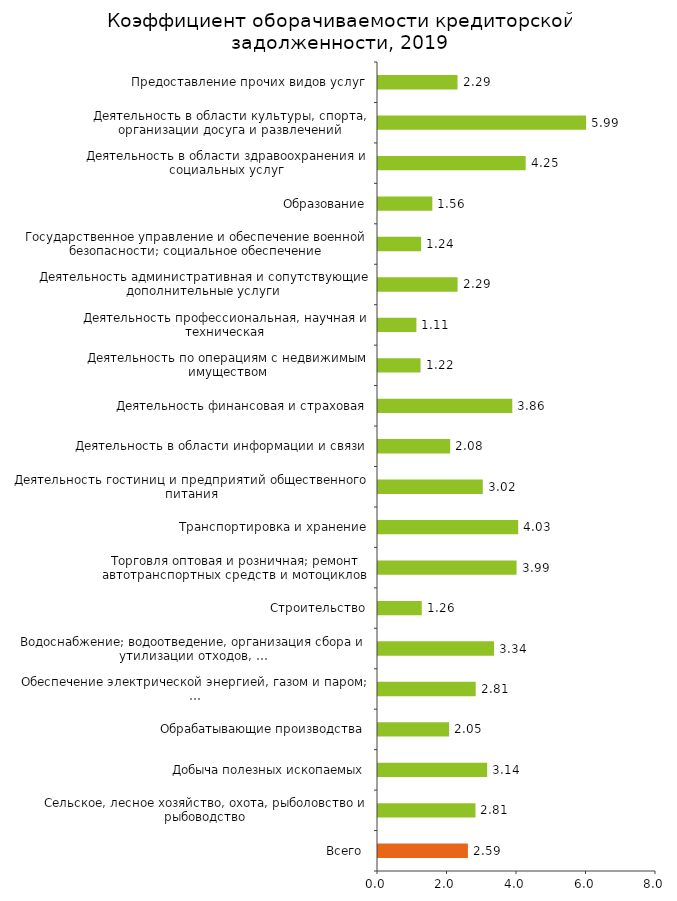
| Category | Series 0 |
|---|---|
| Всего  | 2.587 |
| Сельское, лесное хозяйство, охота, рыболовство и рыбоводство | 2.806 |
| Добыча полезных ископаемых | 3.142 |
| Обрабатывающие производства | 2.046 |
| Обеспечение электрической энергией, газом и паром; … | 2.812 |
| Водоснабжение; водоотведение, организация сбора и утилизации отходов, … | 3.34 |
| Строительство | 1.259 |
| Торговля оптовая и розничная; ремонт автотранспортных средств и мотоциклов | 3.988 |
| Транспортировка и хранение | 4.034 |
| Деятельность гостиниц и предприятий общественного питания | 3.016 |
| Деятельность в области информации и связи | 2.077 |
| Деятельность финансовая и страховая | 3.864 |
| Деятельность по операциям с недвижимым имуществом | 1.224 |
| Деятельность профессиональная, научная и техническая | 1.106 |
| Деятельность административная и сопутствующие дополнительные услуги | 2.291 |
| Государственное управление и обеспечение военной безопасности; социальное обеспечение | 1.239 |
| Образование | 1.564 |
| Деятельность в области здравоохранения и социальных услуг | 4.25 |
| Деятельность в области культуры, спорта, организации досуга и развлечений | 5.989 |
| Предоставление прочих видов услуг | 2.289 |